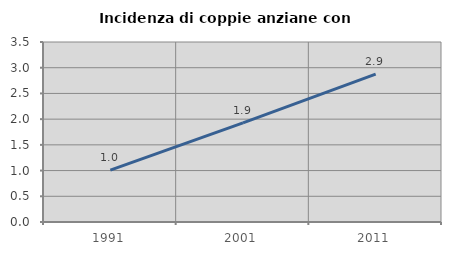
| Category | Incidenza di coppie anziane con figli |
|---|---|
| 1991.0 | 1.008 |
| 2001.0 | 1.927 |
| 2011.0 | 2.874 |